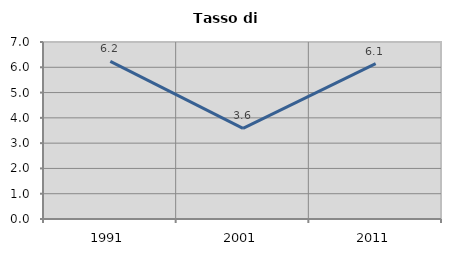
| Category | Tasso di disoccupazione   |
|---|---|
| 1991.0 | 6.232 |
| 2001.0 | 3.584 |
| 2011.0 | 6.144 |